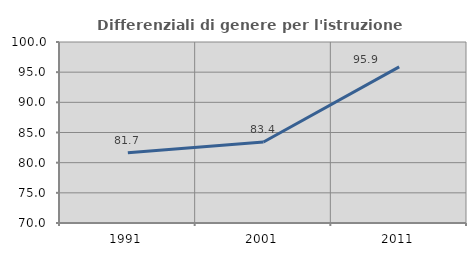
| Category | Differenziali di genere per l'istruzione superiore |
|---|---|
| 1991.0 | 81.653 |
| 2001.0 | 83.429 |
| 2011.0 | 95.87 |